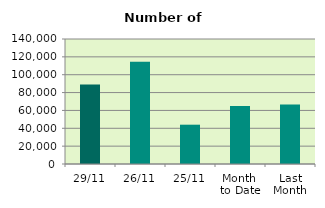
| Category | Series 0 |
|---|---|
| 29/11 | 88906 |
| 26/11 | 114438 |
| 25/11 | 44026 |
| Month 
to Date | 65033.238 |
| Last
Month | 66688.857 |